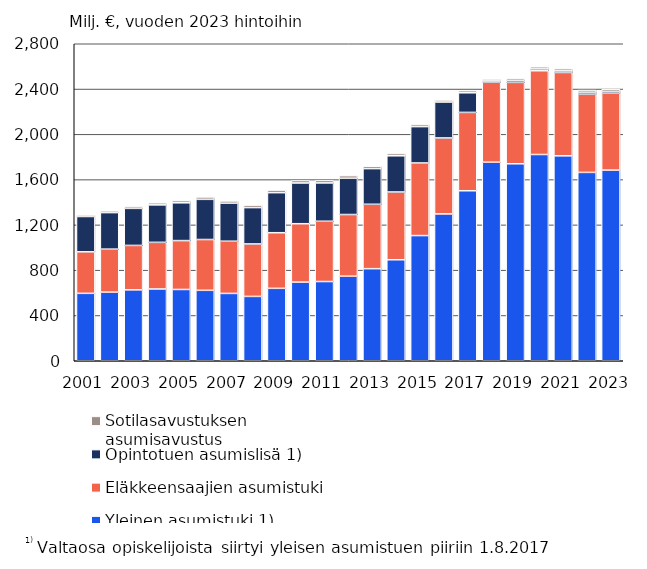
| Category | Yleinen asumistuki 1) | Eläkkeensaajien asumistuki | Opintotuen asumislisä 1) | Sotilasavustuksen asumisavustus |
|---|---|---|---|---|
| 2001.0 | 595.479 | 366.764 | 311.961 | 13.866 |
| 2002.0 | 606.242 | 379.663 | 322.622 | 15.718 |
| 2003.0 | 626.182 | 392.523 | 327.294 | 16.453 |
| 2004.0 | 634.133 | 411.809 | 330.935 | 18.308 |
| 2005.0 | 629.631 | 431.796 | 333.822 | 19.309 |
| 2006.0 | 622.233 | 448.702 | 354.835 | 20.957 |
| 2007.0 | 594.811 | 461.102 | 335.127 | 20.715 |
| 2008.0 | 568.394 | 463.468 | 321.028 | 21.896 |
| 2009.0 | 639.76 | 491.136 | 353.831 | 22.864 |
| 2010.0 | 694.922 | 515.577 | 359.686 | 22.051 |
| 2011.0 | 699.84 | 532.431 | 338.568 | 22.122 |
| 2012.0 | 747.186 | 544.406 | 320.235 | 23.057 |
| 2013.0 | 813.443 | 568.644 | 314.964 | 21.469 |
| 2014.0 | 892.244 | 598.443 | 319.77 | 19.838 |
| 2015.0 | 1105.732 | 641.245 | 321.077 | 18.723 |
| 2016.0 | 1297.156 | 670.766 | 317.489 | 17.888 |
| 2017.0 | 1501.613 | 692.007 | 173.433 | 18.52 |
| 2018.0 | 1753.971 | 706.93 | 10.896 | 16.433 |
| 2019.0 | 1739.939 | 719.105 | 15.743 | 17.318 |
| 2020.0 | 1821.816 | 739.935 | 16.154 | 18.608 |
| 2021.0 | 1810.296 | 736.218 | 14.168 | 19.005 |
| 2022.0 | 1663.606 | 691.194 | 16.668 | 19.453 |
| 2023.0 | 1684.21 | 679.21 | 15.62 | 19.46 |